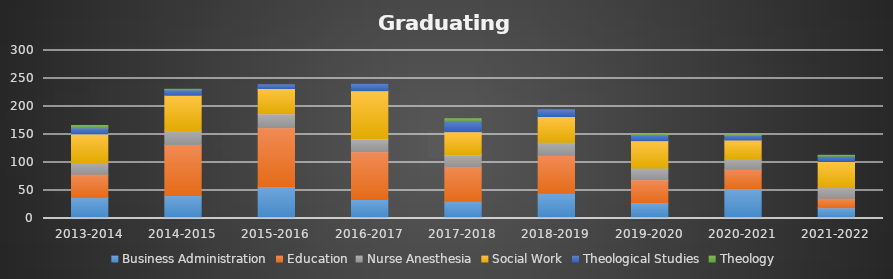
| Category | Business Administration | Education | Nurse Anesthesia | Social Work | Theological Studies | Theology |
|---|---|---|---|---|---|---|
| 2013-2014 | 38 | 41 | 21 | 51 | 11 | 4 |
| 2014-2015 | 41 | 91 | 25 | 63 | 10 | 1 |
| 2015-2016 | 57 | 105 | 25 | 45 | 7 | 0 |
| 2016-2017 | 34 | 85 | 23 | 86 | 12 | 0 |
| 2017-2018 | 31 | 62 | 21 | 41 | 19 | 4 |
| 2018-2019 | 45 | 68 | 23 | 46 | 12 | 0 |
| 2019-2020 | 28 | 41 | 21 | 49 | 10 | 1 |
| 2020-2021 | 53 | 35 | 19 | 33 | 8 | 2 |
| 2021-2022 | 19 | 17 | 20 | 46 | 9 | 2 |